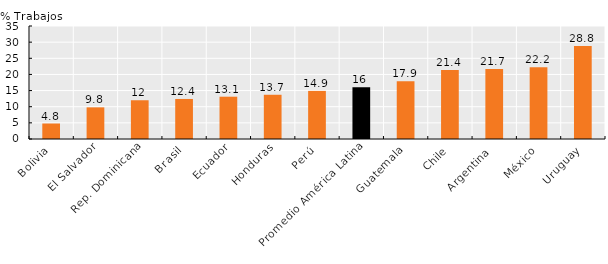
| Category | Series 0 |
|---|---|
| Bolivia | 4.8 |
| El Salvador | 9.8 |
| Rep. Dominicana | 12 |
| Brasil | 12.4 |
| Ecuador | 13.1 |
| Honduras | 13.7 |
| Perú | 14.9 |
| Promedio América Latina | 16 |
| Guatemala | 17.9 |
| Chile | 21.4 |
| Argentina  | 21.7 |
| México | 22.2 |
| Uruguay | 28.8 |